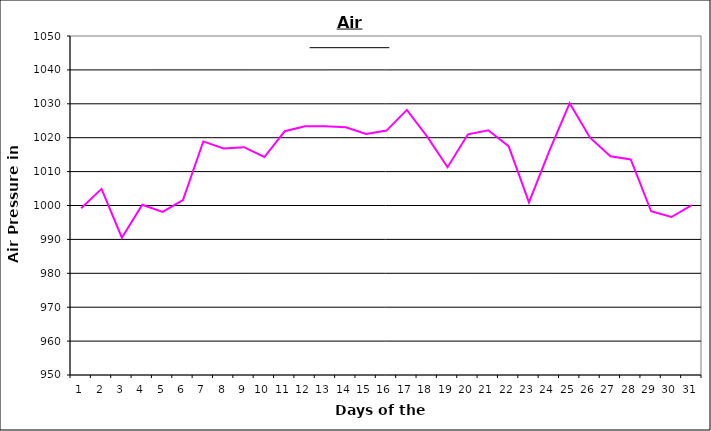
| Category | Series 0 |
|---|---|
| 0 | 999.2 |
| 1 | 1004.9 |
| 2 | 990.5 |
| 3 | 1000.2 |
| 4 | 998.1 |
| 5 | 1001.6 |
| 6 | 1018.9 |
| 7 | 1016.8 |
| 8 | 1017.2 |
| 9 | 1014.3 |
| 10 | 1021.9 |
| 11 | 1023.4 |
| 12 | 1023.4 |
| 13 | 1023.1 |
| 14 | 1021.1 |
| 15 | 1022.1 |
| 16 | 1028.2 |
| 17 | 1020.3 |
| 18 | 1011.3 |
| 19 | 1021 |
| 20 | 1022.2 |
| 21 | 1017.5 |
| 22 | 1000.9 |
| 23 | 1016.1 |
| 24 | 1030.2 |
| 25 | 1020 |
| 26 | 1014.5 |
| 27 | 1013.6 |
| 28 | 998.3 |
| 29 | 996.6 |
| 30 | 1000.1 |